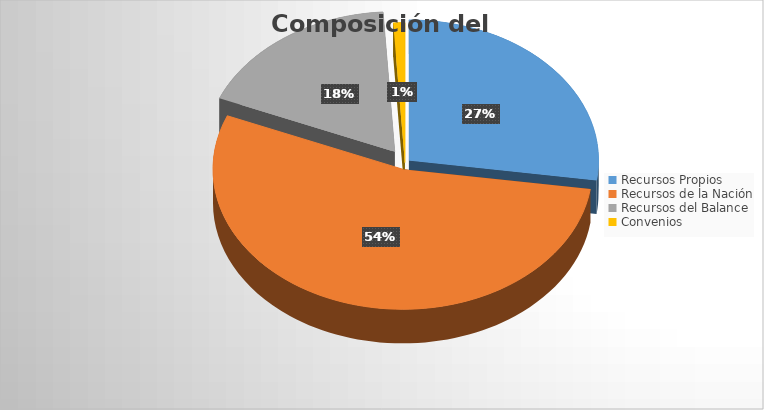
| Category | Series 0 |
|---|---|
| Recursos Propios | 49205363241.176 |
| Recursos de la Nación | 97359554515.82 |
| Recursos del Balance | 32095283336.71 |
| Convenios | 1775223529 |